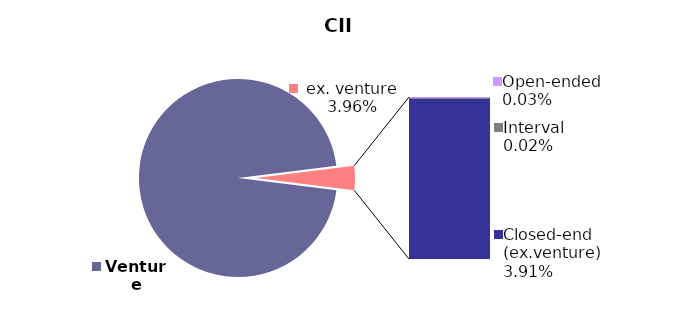
| Category | 30.09.2020 |
|---|---|
| Venture | 0.96 |
| Open-ended | 0 |
| Interval | 0 |
| Closed-end (ex.venture) | 0.039 |